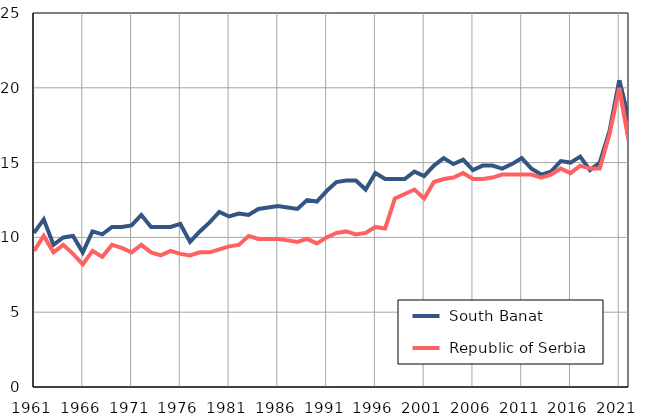
| Category |  South Banat |  Republic of Serbia |
|---|---|---|
| 1961.0 | 10.3 | 9.1 |
| 1962.0 | 11.2 | 10.1 |
| 1963.0 | 9.5 | 9 |
| 1964.0 | 10 | 9.5 |
| 1965.0 | 10.1 | 8.9 |
| 1966.0 | 9 | 8.2 |
| 1967.0 | 10.4 | 9.1 |
| 1968.0 | 10.2 | 8.7 |
| 1969.0 | 10.7 | 9.5 |
| 1970.0 | 10.7 | 9.3 |
| 1971.0 | 10.8 | 9 |
| 1972.0 | 11.5 | 9.5 |
| 1973.0 | 10.7 | 9 |
| 1974.0 | 10.7 | 8.8 |
| 1975.0 | 10.7 | 9.1 |
| 1976.0 | 10.9 | 8.9 |
| 1977.0 | 9.7 | 8.8 |
| 1978.0 | 10.4 | 9 |
| 1979.0 | 11 | 9 |
| 1980.0 | 11.7 | 9.2 |
| 1981.0 | 11.4 | 9.4 |
| 1982.0 | 11.6 | 9.5 |
| 1983.0 | 11.5 | 10.1 |
| 1984.0 | 11.9 | 9.9 |
| 1985.0 | 12 | 9.9 |
| 1986.0 | 12.1 | 9.9 |
| 1987.0 | 12 | 9.8 |
| 1988.0 | 11.9 | 9.7 |
| 1989.0 | 12.5 | 9.9 |
| 1990.0 | 12.4 | 9.6 |
| 1991.0 | 13.1 | 10 |
| 1992.0 | 13.7 | 10.3 |
| 1993.0 | 13.8 | 10.4 |
| 1994.0 | 13.8 | 10.2 |
| 1995.0 | 13.2 | 10.3 |
| 1996.0 | 14.3 | 10.7 |
| 1997.0 | 13.9 | 10.6 |
| 1998.0 | 13.9 | 12.6 |
| 1999.0 | 13.9 | 12.9 |
| 2000.0 | 14.4 | 13.2 |
| 2001.0 | 14.1 | 12.6 |
| 2002.0 | 14.8 | 13.7 |
| 2003.0 | 15.3 | 13.9 |
| 2004.0 | 14.9 | 14 |
| 2005.0 | 15.2 | 14.3 |
| 2006.0 | 14.5 | 13.9 |
| 2007.0 | 14.8 | 13.9 |
| 2008.0 | 14.8 | 14 |
| 2009.0 | 14.6 | 14.2 |
| 2010.0 | 14.9 | 14.2 |
| 2011.0 | 15.3 | 14.2 |
| 2012.0 | 14.6 | 14.2 |
| 2013.0 | 14.2 | 14 |
| 2014.0 | 14.4 | 14.2 |
| 2015.0 | 15.1 | 14.6 |
| 2016.0 | 15 | 14.3 |
| 2017.0 | 15.4 | 14.8 |
| 2018.0 | 14.5 | 14.6 |
| 2019.0 | 15 | 14.6 |
| 2020.0 | 17.1 | 16.9 |
| 2021.0 | 20.5 | 20 |
| 2022.0 | 17.8 | 16.4 |